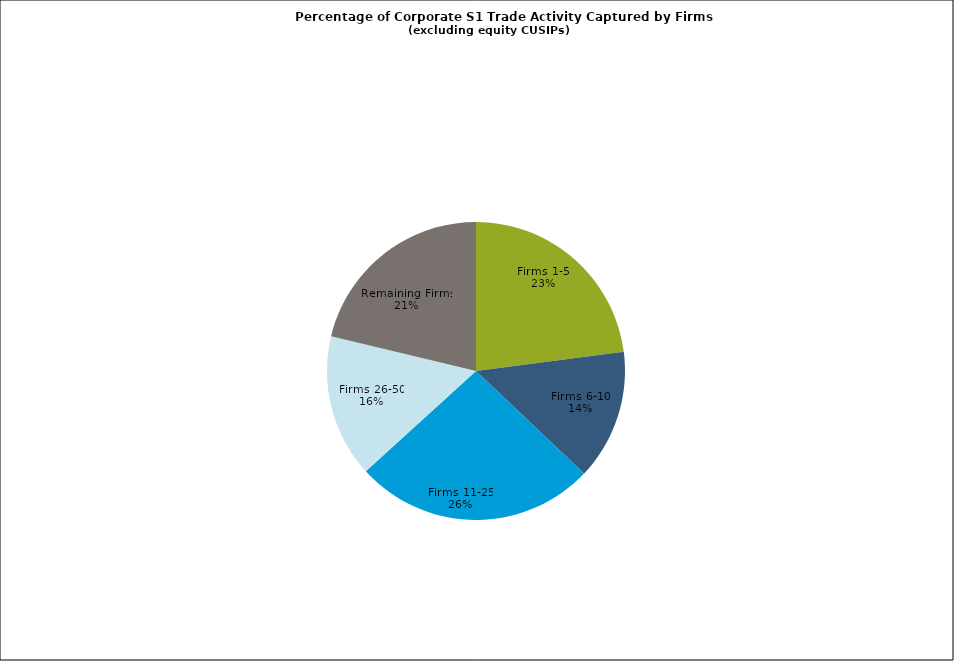
| Category | Series 0 |
|---|---|
| Firms 1-5 | 0.23 |
| Firms 6-10 | 0.141 |
| Firms 11-25 | 0.262 |
| Firms 26-50 | 0.155 |
| Remaining Firms | 0.212 |